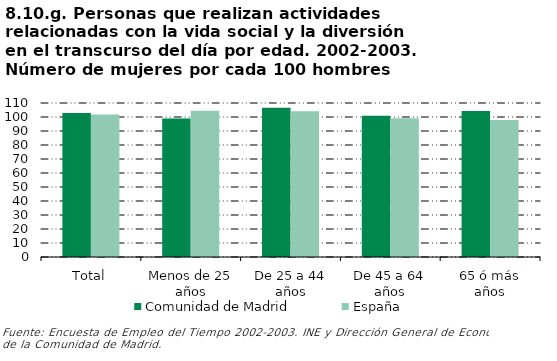
| Category | Comunidad de Madrid | España |
|---|---|---|
| Total | 102.872 | 101.813 |
| Menos de 25 años | 98.952 | 104.412 |
| De 25 a 44 años | 106.667 | 104.062 |
| De 45 a 64 años | 100.87 | 99.076 |
| 65 ó más años | 104.348 | 97.887 |